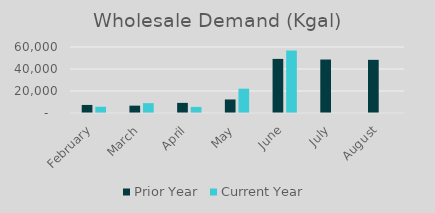
| Category | Prior Year | Current Year |
|---|---|---|
| February | 7328 | 5662 |
| March | 6673 | 8964 |
| April | 9201 | 5557 |
| May | 12299 | 22105 |
| June | 49180 | 56817 |
| July | 48620 | 0 |
| August | 48323 | 0 |